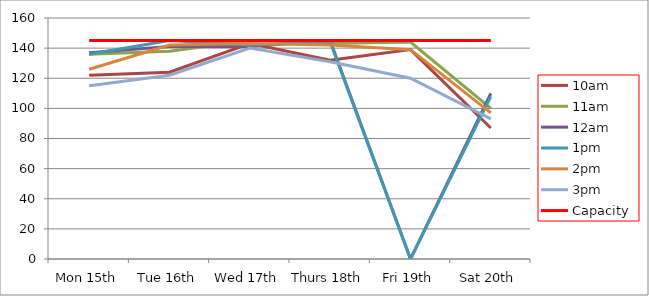
| Category | 9am | 10am | 11am | 12am | 1pm | 2pm | 3pm | 4pm | 5pm | Capacity |
|---|---|---|---|---|---|---|---|---|---|---|
| Mon 15th |  | 122 | 136 | 137 | 136 | 126 | 115 |  |  | 145 |
| Tue 16th |  | 124 | 138 | 141 | 145 | 142 | 122 |  |  | 145 |
| Wed 17th |  | 143 | 145 | 141 | 142 | 143 | 140 |  |  | 145 |
| Thurs 18th |  | 132 | 143 | 145 | 144 | 142 | 131 |  |  | 145 |
| Fri 19th |  | 139 | 144 | 0 | 0 | 139 | 120 |  |  | 145 |
| Sat 20th |  | 87 | 100 | 110 | 108 | 97 | 93 |  |  | 145 |